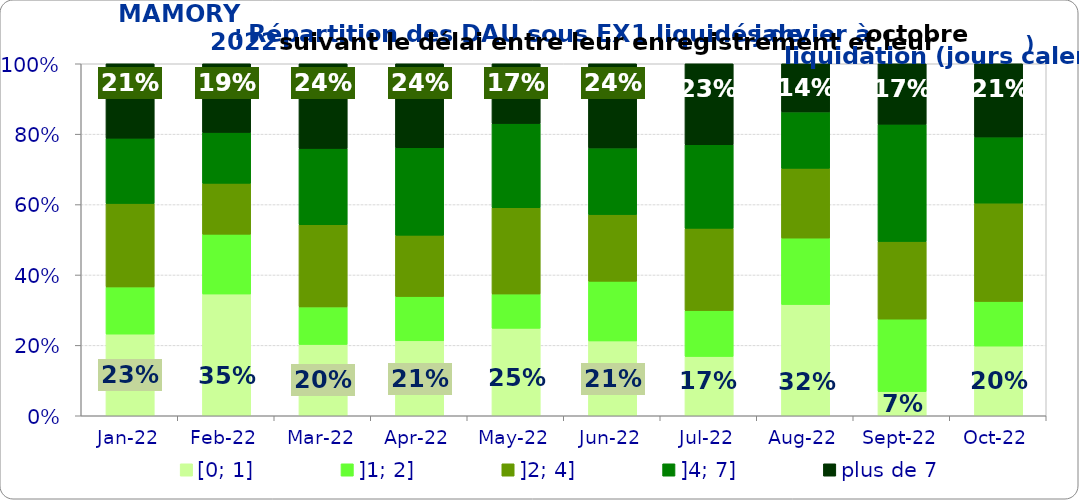
| Category | [0; 1] | ]1; 2] | ]2; 4] | ]4; 7] | plus de 7 |
|---|---|---|---|---|---|
| 2022-01-01 | 0.232 | 0.134 | 0.237 | 0.186 | 0.211 |
| 2022-02-01 | 0.346 | 0.17 | 0.145 | 0.145 | 0.195 |
| 2022-03-01 | 0.203 | 0.107 | 0.234 | 0.216 | 0.241 |
| 2022-04-01 | 0.213 | 0.126 | 0.174 | 0.248 | 0.239 |
| 2022-05-01 | 0.248 | 0.097 | 0.245 | 0.239 | 0.17 |
| 2022-06-01 | 0.213 | 0.169 | 0.189 | 0.189 | 0.239 |
| 2022-07-01 | 0.169 | 0.13 | 0.234 | 0.238 | 0.23 |
| 2022-08-01 | 0.316 | 0.189 | 0.198 | 0.16 | 0.137 |
| 2022-09-01 | 0.069 | 0.206 | 0.221 | 0.333 | 0.172 |
| 2022-10-01 | 0.198 | 0.127 | 0.279 | 0.188 | 0.208 |